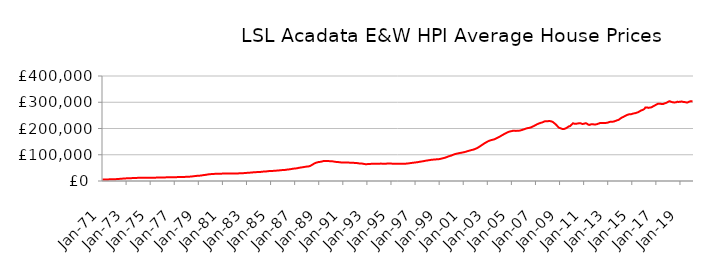
| Category | Series 0 |
|---|---|
| 1971-01-01 | 5724.052 |
| 1971-02-01 | 5764.727 |
| 1971-03-01 | 5805.744 |
| 1971-04-01 | 5859.071 |
| 1971-05-01 | 5947.568 |
| 1971-06-01 | 6039.787 |
| 1971-07-01 | 6153.189 |
| 1971-08-01 | 6276.583 |
| 1971-09-01 | 6398.993 |
| 1971-10-01 | 6526.163 |
| 1971-11-01 | 6663.446 |
| 1971-12-01 | 6830.612 |
| 1972-01-01 | 6946.64 |
| 1972-02-01 | 7022.605 |
| 1972-03-01 | 7195.52 |
| 1972-04-01 | 7437.32 |
| 1972-05-01 | 7786.685 |
| 1972-06-01 | 8093.256 |
| 1972-07-01 | 8445.732 |
| 1972-08-01 | 8785.754 |
| 1972-09-01 | 9085.99 |
| 1972-10-01 | 9366.58 |
| 1972-11-01 | 9626.405 |
| 1972-12-01 | 9894.445 |
| 1973-01-01 | 10086.196 |
| 1973-02-01 | 10221.683 |
| 1973-03-01 | 10377.44 |
| 1973-04-01 | 10555.106 |
| 1973-05-01 | 10782.895 |
| 1973-06-01 | 10930.891 |
| 1973-07-01 | 11085.888 |
| 1973-08-01 | 11257.829 |
| 1973-09-01 | 11458.488 |
| 1973-10-01 | 11666.531 |
| 1973-11-01 | 11825.075 |
| 1973-12-01 | 11938.765 |
| 1974-01-01 | 11999.742 |
| 1974-02-01 | 12065.461 |
| 1974-03-01 | 12062.768 |
| 1974-04-01 | 12036.729 |
| 1974-05-01 | 12013.752 |
| 1974-06-01 | 12014.589 |
| 1974-07-01 | 12026.272 |
| 1974-08-01 | 12065.491 |
| 1974-09-01 | 12136.837 |
| 1974-10-01 | 12224.473 |
| 1974-11-01 | 12297.099 |
| 1974-12-01 | 12368.8 |
| 1975-01-01 | 12401.972 |
| 1975-02-01 | 12443.817 |
| 1975-03-01 | 12518.081 |
| 1975-04-01 | 12623.827 |
| 1975-05-01 | 12752.207 |
| 1975-06-01 | 12820.938 |
| 1975-07-01 | 12888.334 |
| 1975-08-01 | 12981.389 |
| 1975-09-01 | 13107.324 |
| 1975-10-01 | 13247.24 |
| 1975-11-01 | 13370.433 |
| 1975-12-01 | 13502.183 |
| 1976-01-01 | 13594.945 |
| 1976-02-01 | 13682.301 |
| 1976-03-01 | 13742.074 |
| 1976-04-01 | 13805.651 |
| 1976-05-01 | 13888.833 |
| 1976-06-01 | 13943.255 |
| 1976-07-01 | 14003.455 |
| 1976-08-01 | 14092.549 |
| 1976-09-01 | 14220.052 |
| 1976-10-01 | 14363.748 |
| 1976-11-01 | 14478.728 |
| 1976-12-01 | 14581.408 |
| 1977-01-01 | 14638.5 |
| 1977-02-01 | 14704.068 |
| 1977-03-01 | 14746.584 |
| 1977-04-01 | 14796.452 |
| 1977-05-01 | 14873.475 |
| 1977-06-01 | 14943.32 |
| 1977-07-01 | 15029.197 |
| 1977-08-01 | 15146.978 |
| 1977-09-01 | 15291.017 |
| 1977-10-01 | 15453.279 |
| 1977-11-01 | 15624.938 |
| 1977-12-01 | 15849 |
| 1978-01-01 | 16015.39 |
| 1978-02-01 | 16145.255 |
| 1978-03-01 | 16320.261 |
| 1978-04-01 | 16555.686 |
| 1978-05-01 | 16933.102 |
| 1978-06-01 | 17315.025 |
| 1978-07-01 | 17776.942 |
| 1978-08-01 | 18250.744 |
| 1978-09-01 | 18706.734 |
| 1978-10-01 | 19160.153 |
| 1978-11-01 | 19582.961 |
| 1978-12-01 | 20000.721 |
| 1979-01-01 | 20249.228 |
| 1979-02-01 | 20415.907 |
| 1979-03-01 | 20831.095 |
| 1979-04-01 | 21400.214 |
| 1979-05-01 | 22126.495 |
| 1979-06-01 | 22587.387 |
| 1979-07-01 | 23065.762 |
| 1979-08-01 | 23604.455 |
| 1979-09-01 | 24249.836 |
| 1979-10-01 | 24938.747 |
| 1979-11-01 | 25512.34 |
| 1979-12-01 | 25958.028 |
| 1980-01-01 | 26202.72 |
| 1980-02-01 | 26392.91 |
| 1980-03-01 | 26636.942 |
| 1980-04-01 | 26922.685 |
| 1980-05-01 | 27256.94 |
| 1980-06-01 | 27435.742 |
| 1980-07-01 | 27597.878 |
| 1980-08-01 | 27747.714 |
| 1980-09-01 | 27853.364 |
| 1980-10-01 | 27921.018 |
| 1980-11-01 | 27973.017 |
| 1980-12-01 | 28083.641 |
| 1981-01-01 | 28149.402 |
| 1981-02-01 | 28249.159 |
| 1981-03-01 | 28349.185 |
| 1981-04-01 | 28483.438 |
| 1981-05-01 | 28619.554 |
| 1981-06-01 | 28665.734 |
| 1981-07-01 | 28687.757 |
| 1981-08-01 | 28693.199 |
| 1981-09-01 | 28639.156 |
| 1981-10-01 | 28540.531 |
| 1981-11-01 | 28449.988 |
| 1981-12-01 | 28440.131 |
| 1982-01-01 | 28396.186 |
| 1982-02-01 | 28415.433 |
| 1982-03-01 | 28573.016 |
| 1982-04-01 | 28838.513 |
| 1982-05-01 | 29135.915 |
| 1982-06-01 | 29244.445 |
| 1982-07-01 | 29326.329 |
| 1982-08-01 | 29482.476 |
| 1982-09-01 | 29735.669 |
| 1982-10-01 | 30036.483 |
| 1982-11-01 | 30336.175 |
| 1982-12-01 | 30707.835 |
| 1983-01-01 | 30990.247 |
| 1983-02-01 | 31232.959 |
| 1983-03-01 | 31485.859 |
| 1983-04-01 | 31799.274 |
| 1983-05-01 | 32210.334 |
| 1983-06-01 | 32532.911 |
| 1983-07-01 | 32884.142 |
| 1983-08-01 | 33217.828 |
| 1983-09-01 | 33484.567 |
| 1983-10-01 | 33702.791 |
| 1983-11-01 | 33908.719 |
| 1983-12-01 | 34179.18 |
| 1984-01-01 | 34340.828 |
| 1984-02-01 | 34504.946 |
| 1984-03-01 | 34816.545 |
| 1984-04-01 | 35248.792 |
| 1984-05-01 | 35743.59 |
| 1984-06-01 | 35962.963 |
| 1984-07-01 | 36146.557 |
| 1984-08-01 | 36426.283 |
| 1984-09-01 | 36872.65 |
| 1984-10-01 | 37389.081 |
| 1984-11-01 | 37788.221 |
| 1984-12-01 | 38065.626 |
| 1985-01-01 | 38142.632 |
| 1985-02-01 | 38249.055 |
| 1985-03-01 | 38510.694 |
| 1985-04-01 | 38878.195 |
| 1985-05-01 | 39297.821 |
| 1985-06-01 | 39459.982 |
| 1985-07-01 | 39609.899 |
| 1985-08-01 | 39869.781 |
| 1985-09-01 | 40303.194 |
| 1985-10-01 | 40798.184 |
| 1985-11-01 | 41214.216 |
| 1985-12-01 | 41546.956 |
| 1986-01-01 | 41676.289 |
| 1986-02-01 | 41808.343 |
| 1986-03-01 | 42194.079 |
| 1986-04-01 | 42752.059 |
| 1986-05-01 | 43448.482 |
| 1986-06-01 | 43870.111 |
| 1986-07-01 | 44301.132 |
| 1986-08-01 | 44815.67 |
| 1986-09-01 | 45462.382 |
| 1986-10-01 | 46160.79 |
| 1986-11-01 | 46794.738 |
| 1986-12-01 | 47385.809 |
| 1987-01-01 | 47728.735 |
| 1987-02-01 | 48012.679 |
| 1987-03-01 | 48628.588 |
| 1987-04-01 | 49457.847 |
| 1987-05-01 | 50448.678 |
| 1987-06-01 | 51007.765 |
| 1987-07-01 | 51542.618 |
| 1987-08-01 | 52131.235 |
| 1987-09-01 | 52770.168 |
| 1987-10-01 | 53431.581 |
| 1987-11-01 | 54051.264 |
| 1987-12-01 | 54693.136 |
| 1988-01-01 | 54998.269 |
| 1988-02-01 | 55261.433 |
| 1988-03-01 | 56181.853 |
| 1988-04-01 | 57567.018 |
| 1988-05-01 | 59651.186 |
| 1988-06-01 | 61754.283 |
| 1988-07-01 | 64230.632 |
| 1988-08-01 | 66508.571 |
| 1988-09-01 | 68262.579 |
| 1988-10-01 | 69718.912 |
| 1988-11-01 | 70890.185 |
| 1988-12-01 | 71930.099 |
| 1989-01-01 | 72473.695 |
| 1989-02-01 | 72933.253 |
| 1989-03-01 | 73713.269 |
| 1989-04-01 | 74706.375 |
| 1989-05-01 | 75758.491 |
| 1989-06-01 | 76218.182 |
| 1989-07-01 | 76531.16 |
| 1989-08-01 | 76677.894 |
| 1989-09-01 | 76551.393 |
| 1989-10-01 | 76197.409 |
| 1989-11-01 | 75726.489 |
| 1989-12-01 | 75342.662 |
| 1990-01-01 | 74997.209 |
| 1990-02-01 | 74983.033 |
| 1990-03-01 | 74468.301 |
| 1990-04-01 | 73800.231 |
| 1990-05-01 | 73019.079 |
| 1990-06-01 | 72646.325 |
| 1990-07-01 | 72328.69 |
| 1990-08-01 | 72019.086 |
| 1990-09-01 | 71584.02 |
| 1990-10-01 | 71086.736 |
| 1990-11-01 | 70625.213 |
| 1990-12-01 | 70429.161 |
| 1991-01-01 | 70291.343 |
| 1991-02-01 | 70365.195 |
| 1991-03-01 | 70253.325 |
| 1991-04-01 | 70179.426 |
| 1991-05-01 | 70082.158 |
| 1991-06-01 | 70038.63 |
| 1991-07-01 | 69992.377 |
| 1991-08-01 | 69927.492 |
| 1991-09-01 | 69816.431 |
| 1991-10-01 | 69617.764 |
| 1991-11-01 | 69292.362 |
| 1991-12-01 | 68948.205 |
| 1992-01-01 | 68607.347 |
| 1992-02-01 | 68555.077 |
| 1992-03-01 | 68076.952 |
| 1992-04-01 | 67499.842 |
| 1992-05-01 | 66862.788 |
| 1992-06-01 | 66654.255 |
| 1992-07-01 | 66504.32 |
| 1992-08-01 | 66189.656 |
| 1992-09-01 | 65518.05 |
| 1992-10-01 | 64684.723 |
| 1992-11-01 | 64119.825 |
| 1992-12-01 | 64136.269 |
| 1993-01-01 | 64294.945 |
| 1993-02-01 | 64575.741 |
| 1993-03-01 | 64828.051 |
| 1993-04-01 | 65143.693 |
| 1993-05-01 | 65412.799 |
| 1993-06-01 | 65443.582 |
| 1993-07-01 | 65463.054 |
| 1993-08-01 | 65516.954 |
| 1993-09-01 | 65475.951 |
| 1993-10-01 | 65357.973 |
| 1993-11-01 | 65280.77 |
| 1993-12-01 | 65509.301 |
| 1994-01-01 | 65823.679 |
| 1994-02-01 | 66215.591 |
| 1994-03-01 | 66200.652 |
| 1994-04-01 | 66040.858 |
| 1994-05-01 | 65900.526 |
| 1994-06-01 | 65913.104 |
| 1994-07-01 | 65992.304 |
| 1994-08-01 | 66155.2 |
| 1994-09-01 | 66414.12 |
| 1994-10-01 | 66727.801 |
| 1994-11-01 | 66876.257 |
| 1994-12-01 | 66788.676 |
| 1995-01-01 | 66299.285 |
| 1995-02-01 | 65878.008 |
| 1995-03-01 | 65719.605 |
| 1995-04-01 | 65554.552 |
| 1995-05-01 | 65582.512 |
| 1995-06-01 | 65443.379 |
| 1995-07-01 | 65586.036 |
| 1995-08-01 | 65649.397 |
| 1995-09-01 | 65686.864 |
| 1995-10-01 | 65663.319 |
| 1995-11-01 | 65746.116 |
| 1995-12-01 | 65826.774 |
| 1996-01-01 | 65850.653 |
| 1996-02-01 | 65810.587 |
| 1996-03-01 | 66028.038 |
| 1996-04-01 | 66284.657 |
| 1996-05-01 | 66772.208 |
| 1996-06-01 | 67129.112 |
| 1996-07-01 | 67711.942 |
| 1996-08-01 | 68275.864 |
| 1996-09-01 | 68845.613 |
| 1996-10-01 | 69260.464 |
| 1996-11-01 | 69700.306 |
| 1996-12-01 | 70322.263 |
| 1997-01-01 | 70768.381 |
| 1997-02-01 | 71243.642 |
| 1997-03-01 | 71649.555 |
| 1997-04-01 | 72308.33 |
| 1997-05-01 | 73168.819 |
| 1997-06-01 | 73822.225 |
| 1997-07-01 | 74283.52 |
| 1997-08-01 | 75018.824 |
| 1997-09-01 | 75676.696 |
| 1997-10-01 | 76528.781 |
| 1997-11-01 | 77124.603 |
| 1997-12-01 | 77881.3 |
| 1998-01-01 | 78330.231 |
| 1998-02-01 | 79004.394 |
| 1998-03-01 | 79592.47 |
| 1998-04-01 | 80322.56 |
| 1998-05-01 | 80841.191 |
| 1998-06-01 | 81159.809 |
| 1998-07-01 | 81541.341 |
| 1998-08-01 | 81898.34 |
| 1998-09-01 | 82259.693 |
| 1998-10-01 | 82499.46 |
| 1998-11-01 | 82779.197 |
| 1998-12-01 | 83115.498 |
| 1999-01-01 | 83613.265 |
| 1999-02-01 | 84607.397 |
| 1999-03-01 | 85483.743 |
| 1999-04-01 | 86353.108 |
| 1999-05-01 | 87305.138 |
| 1999-06-01 | 88312.28 |
| 1999-07-01 | 89497.981 |
| 1999-08-01 | 91032.635 |
| 1999-09-01 | 92597.032 |
| 1999-10-01 | 94034.378 |
| 1999-11-01 | 95010.364 |
| 1999-12-01 | 96321.288 |
| 2000-01-01 | 97366.774 |
| 2000-02-01 | 99251.532 |
| 2000-03-01 | 100730.988 |
| 2000-04-01 | 102308.236 |
| 2000-05-01 | 103106.757 |
| 2000-06-01 | 104085.675 |
| 2000-07-01 | 104959.016 |
| 2000-08-01 | 105772.797 |
| 2000-09-01 | 106528.421 |
| 2000-10-01 | 107304.612 |
| 2000-11-01 | 107943.909 |
| 2000-12-01 | 108757.874 |
| 2001-01-01 | 109417.271 |
| 2001-02-01 | 110440.317 |
| 2001-03-01 | 111397.347 |
| 2001-04-01 | 112573.02 |
| 2001-05-01 | 113841.339 |
| 2001-06-01 | 114892.733 |
| 2001-07-01 | 116039.556 |
| 2001-08-01 | 117182.64 |
| 2001-09-01 | 118217.849 |
| 2001-10-01 | 118912.764 |
| 2001-11-01 | 120098.452 |
| 2001-12-01 | 121411.939 |
| 2002-01-01 | 123166.767 |
| 2002-02-01 | 124871.682 |
| 2002-03-01 | 126908.869 |
| 2002-04-01 | 129102.371 |
| 2002-05-01 | 131578.986 |
| 2002-06-01 | 134087.286 |
| 2002-07-01 | 136833.825 |
| 2002-08-01 | 139273.788 |
| 2002-09-01 | 141863.407 |
| 2002-10-01 | 144288.693 |
| 2002-11-01 | 146419.218 |
| 2002-12-01 | 148765.121 |
| 2003-01-01 | 150857.648 |
| 2003-02-01 | 152575.228 |
| 2003-03-01 | 153963.556 |
| 2003-04-01 | 155291.778 |
| 2003-05-01 | 156419.19 |
| 2003-06-01 | 157325.604 |
| 2003-07-01 | 158124.52 |
| 2003-08-01 | 159695.266 |
| 2003-09-01 | 161335.594 |
| 2003-10-01 | 163479.587 |
| 2003-11-01 | 165561.004 |
| 2003-12-01 | 167304.174 |
| 2004-01-01 | 169237.373 |
| 2004-02-01 | 171569.665 |
| 2004-03-01 | 173826.226 |
| 2004-04-01 | 175870.599 |
| 2004-05-01 | 178091.302 |
| 2004-06-01 | 180200.731 |
| 2004-07-01 | 182234.825 |
| 2004-08-01 | 184303.51 |
| 2004-09-01 | 185935.388 |
| 2004-10-01 | 187601.536 |
| 2004-11-01 | 188503.108 |
| 2004-12-01 | 189492.009 |
| 2005-01-01 | 190271.849 |
| 2005-02-01 | 191414.961 |
| 2005-03-01 | 191307.384 |
| 2005-04-01 | 191385.931 |
| 2005-05-01 | 190789.147 |
| 2005-06-01 | 191309.844 |
| 2005-07-01 | 191319.555 |
| 2005-08-01 | 191569.071 |
| 2005-09-01 | 192146.589 |
| 2005-10-01 | 193274.487 |
| 2005-11-01 | 194204.629 |
| 2005-12-01 | 195787.179 |
| 2006-01-01 | 196789.447 |
| 2006-02-01 | 198441.023 |
| 2006-03-01 | 199612.645 |
| 2006-04-01 | 200830.649 |
| 2006-05-01 | 201614.139 |
| 2006-06-01 | 202207.347 |
| 2006-07-01 | 203075.969 |
| 2006-08-01 | 204234.21 |
| 2006-09-01 | 205945.735 |
| 2006-10-01 | 207990.011 |
| 2006-11-01 | 209617.09 |
| 2006-12-01 | 211765.837 |
| 2007-01-01 | 213538.029 |
| 2007-02-01 | 216107.841 |
| 2007-03-01 | 217479.29 |
| 2007-04-01 | 219272.042 |
| 2007-05-01 | 220315.078 |
| 2007-06-01 | 222009.115 |
| 2007-07-01 | 222687.123 |
| 2007-08-01 | 224460.722 |
| 2007-09-01 | 226227.808 |
| 2007-10-01 | 227540.609 |
| 2007-11-01 | 227284.839 |
| 2007-12-01 | 227433.413 |
| 2008-01-01 | 227827.129 |
| 2008-02-01 | 228741.432 |
| 2008-03-01 | 228118.902 |
| 2008-04-01 | 227674.481 |
| 2008-05-01 | 226200.506 |
| 2008-06-01 | 224434.589 |
| 2008-07-01 | 221197.984 |
| 2008-08-01 | 218181.885 |
| 2008-09-01 | 214541.399 |
| 2008-10-01 | 210634.505 |
| 2008-11-01 | 206130.652 |
| 2008-12-01 | 202930.031 |
| 2009-01-01 | 201447.291 |
| 2009-02-01 | 200195.627 |
| 2009-03-01 | 198543.307 |
| 2009-04-01 | 197695.062 |
| 2009-05-01 | 198115.164 |
| 2009-06-01 | 199629.16 |
| 2009-07-01 | 201223.033 |
| 2009-08-01 | 203501.941 |
| 2009-09-01 | 206187.319 |
| 2009-10-01 | 208584.386 |
| 2009-11-01 | 209002.713 |
| 2009-12-01 | 213111.81 |
| 2010-01-01 | 216322.861 |
| 2010-02-01 | 219924.872 |
| 2010-03-01 | 218537.513 |
| 2010-04-01 | 217809.916 |
| 2010-05-01 | 217968.902 |
| 2010-06-01 | 218732.691 |
| 2010-07-01 | 219353.324 |
| 2010-08-01 | 220110.662 |
| 2010-09-01 | 220078.897 |
| 2010-10-01 | 219216.311 |
| 2010-11-01 | 217612.082 |
| 2010-12-01 | 217601.628 |
| 2011-01-01 | 218123.147 |
| 2011-02-01 | 219783.244 |
| 2011-03-01 | 219987.92 |
| 2011-04-01 | 217896.56 |
| 2011-05-01 | 215070.552 |
| 2011-06-01 | 213541.473 |
| 2011-07-01 | 214581.343 |
| 2011-08-01 | 216103.808 |
| 2011-09-01 | 216078.388 |
| 2011-10-01 | 216350.889 |
| 2011-11-01 | 215125.515 |
| 2011-12-01 | 215194.364 |
| 2012-01-01 | 215889.202 |
| 2012-02-01 | 216649.949 |
| 2012-03-01 | 218490.049 |
| 2012-04-01 | 219309.105 |
| 2012-05-01 | 221366.338 |
| 2012-06-01 | 221374.859 |
| 2012-07-01 | 221152.402 |
| 2012-08-01 | 220672.565 |
| 2012-09-01 | 220892.388 |
| 2012-10-01 | 221300.28 |
| 2012-11-01 | 221404.715 |
| 2012-12-01 | 222092.485 |
| 2013-01-01 | 222828.062 |
| 2013-02-01 | 224736.007 |
| 2013-03-01 | 225563.602 |
| 2013-04-01 | 226164.103 |
| 2013-05-01 | 225918.187 |
| 2013-06-01 | 226228.04 |
| 2013-07-01 | 227080.324 |
| 2013-08-01 | 228563.69 |
| 2013-09-01 | 230019.564 |
| 2013-10-01 | 231440.016 |
| 2013-11-01 | 232463.672 |
| 2013-12-01 | 234563.62 |
| 2014-01-01 | 237731.853 |
| 2014-02-01 | 240085.262 |
| 2014-03-01 | 242490.266 |
| 2014-04-01 | 243846.284 |
| 2014-05-01 | 246353.992 |
| 2014-06-01 | 248299.609 |
| 2014-07-01 | 249974.467 |
| 2014-08-01 | 251808.985 |
| 2014-09-01 | 253264.294 |
| 2014-10-01 | 254173.734 |
| 2014-11-01 | 254133.079 |
| 2014-12-01 | 254541.274 |
| 2015-01-01 | 255934.852 |
| 2015-02-01 | 257129.326 |
| 2015-03-01 | 257789.049 |
| 2015-04-01 | 258434.787 |
| 2015-05-01 | 259684.669 |
| 2015-06-01 | 261066.233 |
| 2015-07-01 | 262251.645 |
| 2015-08-01 | 264717.432 |
| 2015-09-01 | 266713.534 |
| 2015-10-01 | 269501.277 |
| 2015-11-01 | 270030.765 |
| 2015-12-01 | 272163.513 |
| 2016-01-01 | 274278.167 |
| 2016-02-01 | 279877.834 |
| 2016-03-01 | 280331.651 |
| 2016-04-01 | 280345.685 |
| 2016-05-01 | 278556.098 |
| 2016-06-01 | 279434.619 |
| 2016-07-01 | 279850.12 |
| 2016-08-01 | 280621.452 |
| 2016-09-01 | 282411.787 |
| 2016-10-01 | 285152.678 |
| 2016-11-01 | 286893.745 |
| 2016-12-01 | 289111.019 |
| 2017-01-01 | 291359.405 |
| 2017-02-01 | 293129.968 |
| 2017-03-01 | 294670.028 |
| 2017-04-01 | 294572.006 |
| 2017-05-01 | 294562.665 |
| 2017-06-01 | 293292.937 |
| 2017-07-01 | 293115.677 |
| 2017-08-01 | 293460.087 |
| 2017-09-01 | 295346.705 |
| 2017-10-01 | 296793.859 |
| 2017-11-01 | 297984.302 |
| 2017-12-01 | 300053.977 |
| 2018-01-01 | 302452.608 |
| 2018-02-01 | 303904.3 |
| 2018-03-01 | 303048.076 |
| 2018-04-01 | 301259.074 |
| 2018-05-01 | 299998.811 |
| 2018-06-01 | 299712.13 |
| 2018-07-01 | 298917.778 |
| 2018-08-01 | 299655.274 |
| 2018-09-01 | 300174.243 |
| 2018-10-01 | 302205.014 |
| 2018-11-01 | 301197.059 |
| 2018-12-01 | 301588.29 |
| 2019-01-01 | 301745.076 |
| 2019-02-01 | 303170.118 |
| 2019-03-01 | 302108.425 |
| 2019-04-01 | 301046.304 |
| 2019-05-01 | 300707.339 |
| 2019-06-01 | 300176.143 |
| 2019-07-01 | 299300.087 |
| 2019-08-01 | 299136.692 |
| 2019-09-01 | 300770.022 |
| 2019-10-01 | 302830.688 |
| 2019-11-01 | 303632.493 |
| 2019-12-01 | 303841.705 |
| 2020-01-01 | 304280.422 |